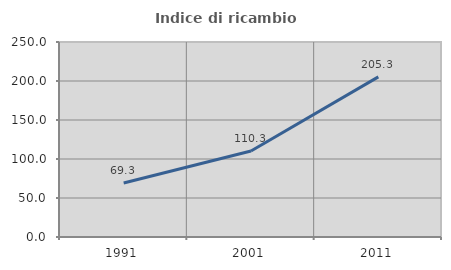
| Category | Indice di ricambio occupazionale  |
|---|---|
| 1991.0 | 69.332 |
| 2001.0 | 110.278 |
| 2011.0 | 205.276 |